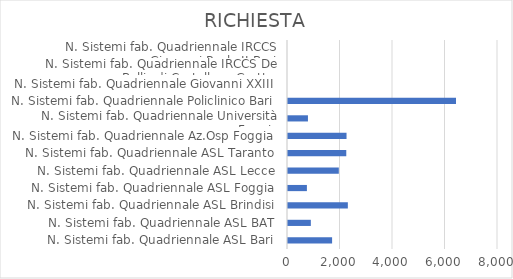
| Category | RICHIESTA |
|---|---|
| N. Sistemi fab. Quadriennale ASL Bari | 1680 |
| N. Sistemi fab. Quadriennale ASL BAT | 870 |
| N. Sistemi fab. Quadriennale ASL Brindisi | 2280 |
| N. Sistemi fab. Quadriennale ASL Foggia | 720 |
| N. Sistemi fab. Quadriennale ASL Lecce | 1936 |
| N. Sistemi fab. Quadriennale ASL Taranto | 2220 |
| N. Sistemi fab. Quadriennale Az.Osp Foggia | 2230 |
| N. Sistemi fab. Quadriennale Università Foggia | 760 |
| N. Sistemi fab. Quadriennale Policlinico Bari | 6400 |
| N. Sistemi fab. Quadriennale Giovanni XXIII | 0 |
| N. Sistemi fab. Quadriennale IRCCS De Bellis di Castellana Grotte | 0 |
| N. Sistemi fab. Quadriennale IRCCS Giovanni Paolo II Bari | 0 |